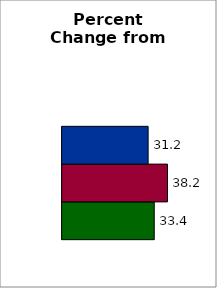
| Category | 50 states and D.C. | SREB states | State |
|---|---|---|---|
| 0 | 33.401 | 38.193 | 31.185 |